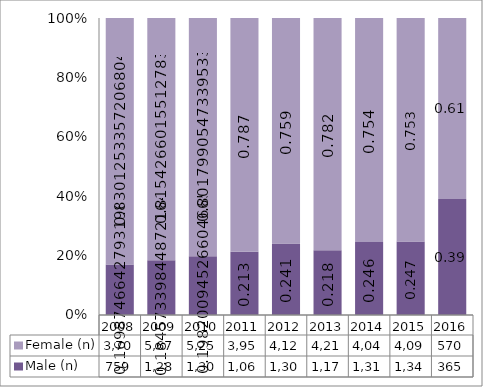
| Category | Male (n) | Female (n) |
|---|---|---|
| 2008.0 | 759 | 3709 |
| 2009.0 | 1285 | 5677 |
| 2010.0 | 1300 | 5259 |
| 2011.0 | 1069 | 3958 |
| 2012.0 | 1309 | 4126 |
| 2013.0 | 1177 | 4216 |
| 2014.0 | 1318 | 4047 |
| 2015.0 | 1348 | 4099 |
| 2016.0 | 365 | 570 |